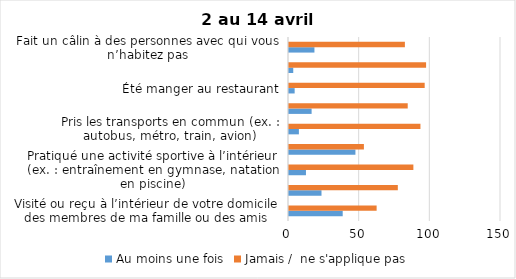
| Category | Au moins une fois | Jamais /  ne s'applique pas |
|---|---|---|
| Visité ou reçu à l’intérieur de votre domicile des membres de ma famille ou des amis | 38 | 62 |
| Visité ou pris soin de vos proches âgés de 70 ans ou plus | 23 | 77 |
| Pratiqué une activité sportive à l’intérieur (ex. : entraînement en gymnase, natation en piscine) | 12 | 88 |
| Pratiqué une activité sportive à l’extérieur (ex. : course à pied, ski) | 47 | 53 |
| Pris les transports en commun (ex. : autobus, métro, train, avion) | 7 | 93 |
| Été dans une autre région du Québec (ex. : j’ai été à mon chalet) | 16 | 84 |
| Été manger au restaurant | 4 | 96 |
| Été au cinéma | 3 | 97 |
| Fait un câlin à des personnes avec qui vous n’habitez pas | 18 | 82 |